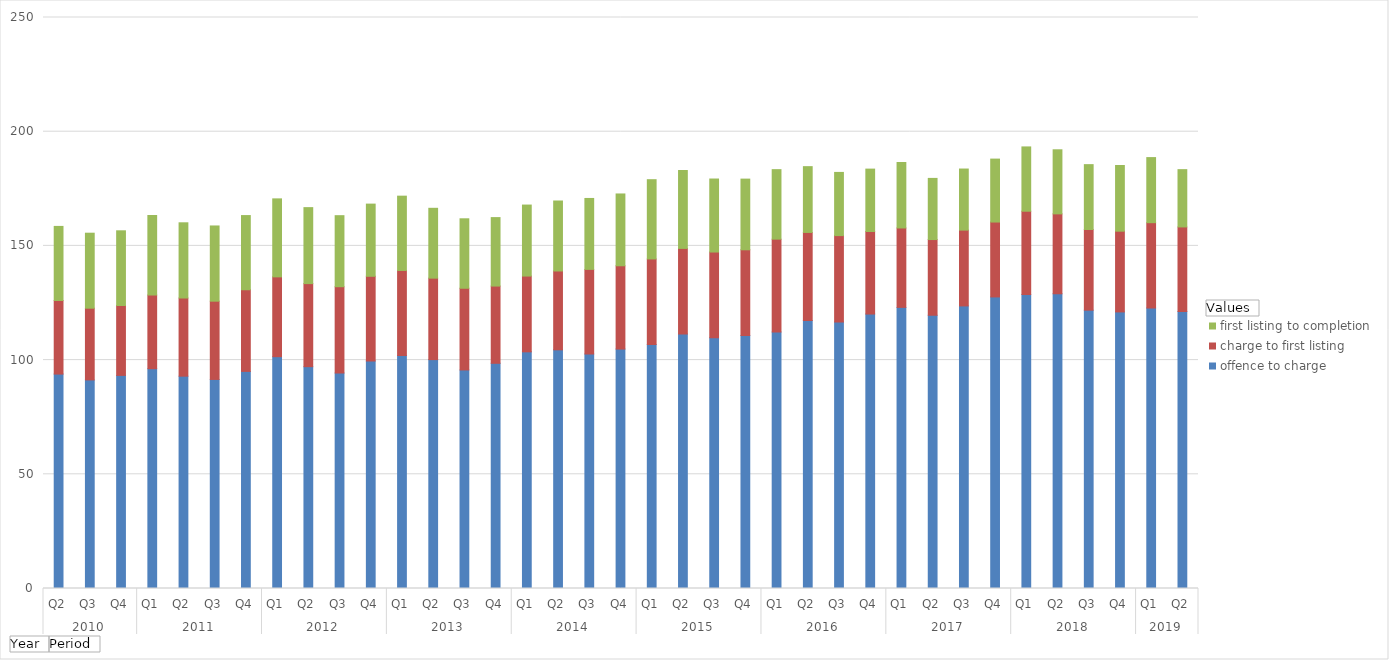
| Category | offence to charge | charge to first listing | first listing to completion |
|---|---|---|---|
| 0 | 93.881 | 32.2 | 32.452 |
| 1 | 91.319 | 31.408 | 32.835 |
| 2 | 93.302 | 30.604 | 32.703 |
| 3 | 96.238 | 32.256 | 34.822 |
| 4 | 92.964 | 34.221 | 32.929 |
| 5 | 91.536 | 34.261 | 32.93 |
| 6 | 95.059 | 35.744 | 32.477 |
| 7 | 101.499 | 34.945 | 34.146 |
| 8 | 97.123 | 36.367 | 33.267 |
| 9 | 94.344 | 37.787 | 31.101 |
| 10 | 99.601 | 37.095 | 31.601 |
| 11 | 102.042 | 37.2 | 32.533 |
| 12 | 100.216 | 35.662 | 30.582 |
| 13 | 95.681 | 35.772 | 30.416 |
| 14 | 98.599 | 33.815 | 29.977 |
| 15 | 103.614 | 33.178 | 31.089 |
| 16 | 104.498 | 34.52 | 30.641 |
| 17 | 102.641 | 37.078 | 31.054 |
| 18 | 104.835 | 36.462 | 31.443 |
| 19 | 106.777 | 37.507 | 34.704 |
| 20 | 111.38 | 37.521 | 34.103 |
| 21 | 109.829 | 37.483 | 31.972 |
| 22 | 110.777 | 37.518 | 30.946 |
| 23 | 112.251 | 40.709 | 30.426 |
| 24 | 117.287 | 38.605 | 28.805 |
| 25 | 116.676 | 37.832 | 27.665 |
| 26 | 120.165 | 36.133 | 27.321 |
| 27 | 123.082 | 34.768 | 28.674 |
| 28 | 119.635 | 33.147 | 26.77 |
| 29 | 123.723 | 33.186 | 26.746 |
| 30 | 127.657 | 32.787 | 27.56 |
| 31 | 128.708 | 36.48 | 28.151 |
| 32 | 129.043 | 34.979 | 28.058 |
| 33 | 121.861 | 35.327 | 28.389 |
| 34 | 121.096 | 35.343 | 28.768 |
| 35 | 122.845 | 37.323 | 28.497 |
| 36 | 121.254 | 37.046 | 25.085 |